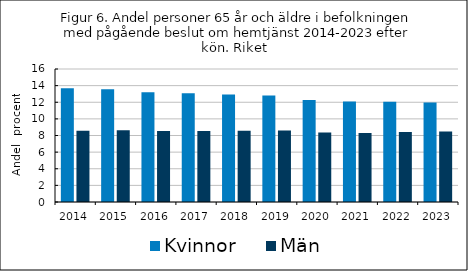
| Category | Kvinnor    | Män   |
|---|---|---|
| 2014.0 | 13.67 | 8.579 |
| 2015.0 | 13.568 | 8.633 |
| 2016.0 | 13.199 | 8.527 |
| 2017.0 | 13.093 | 8.533 |
| 2018.0 | 12.921 | 8.558 |
| 2019.0 | 12.807 | 8.592 |
| 2020.0 | 12.276 | 8.359 |
| 2021.0 | 12.083 | 8.287 |
| 2022.0 | 12.059 | 8.434 |
| 2023.0 | 11.961 | 8.477 |